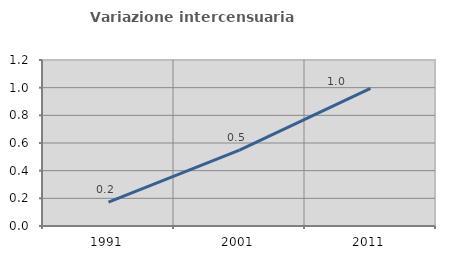
| Category | Variazione intercensuaria annua |
|---|---|
| 1991.0 | 0.173 |
| 2001.0 | 0.548 |
| 2011.0 | 0.995 |